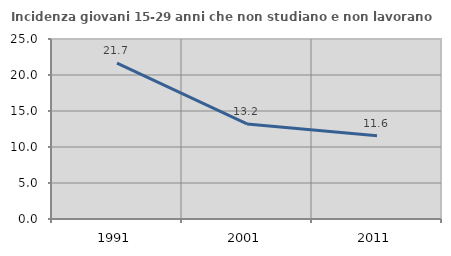
| Category | Incidenza giovani 15-29 anni che non studiano e non lavorano  |
|---|---|
| 1991.0 | 21.661 |
| 2001.0 | 13.208 |
| 2011.0 | 11.579 |